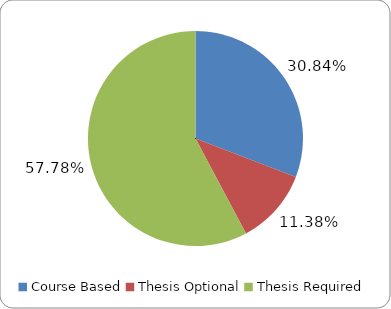
| Category | Total |
|---|---|
| Course Based | 0.308 |
| Thesis Optional | 0.114 |
| Thesis Required | 0.578 |